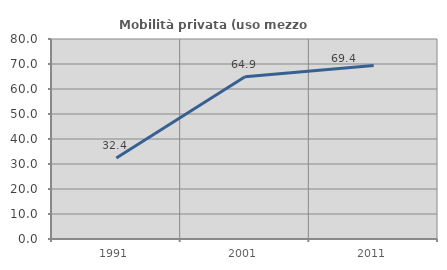
| Category | Mobilità privata (uso mezzo privato) |
|---|---|
| 1991.0 | 32.422 |
| 2001.0 | 64.904 |
| 2011.0 | 69.378 |